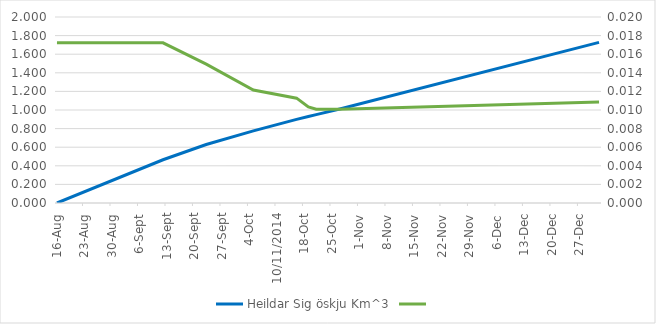
| Category | Heildar Sig öskju Km^3 |
|---|---|
| 2014-08-16 | 0 |
| 2014-09-12 | 0.465 |
| 2014-09-23 | 0.629 |
| 2014-10-05 | 0.775 |
| 2014-10-16 | 0.899 |
| 2014-10-19 | 0.93 |
| 2014-10-21 | 0.95 |
| 2014-10-27 | 1.011 |
| 2015-01-01 | 1.727 |